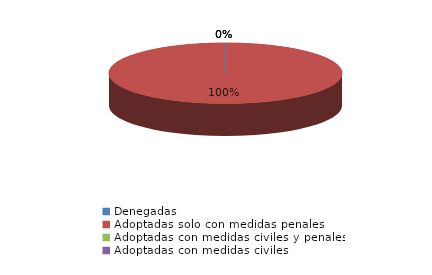
| Category | Series 0 |
|---|---|
| Denegadas | 0 |
| Adoptadas solo con medidas penales | 59 |
| Adoptadas con medidas civiles y penales | 0 |
| Adoptadas con medidas civiles | 0 |